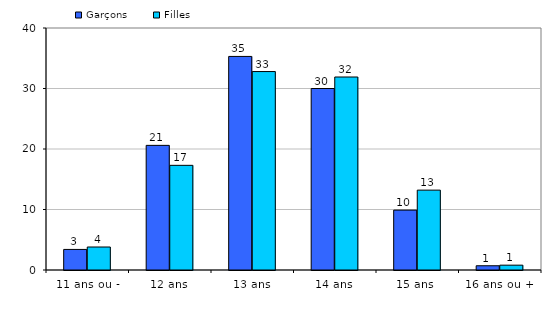
| Category | Garçons | Filles |
|---|---|---|
| 11 ans ou - | 3.4 | 3.8 |
| 12 ans | 20.6 | 17.3 |
| 13 ans | 35.3 | 32.8 |
| 14 ans | 30 | 31.9 |
| 15 ans  | 9.9 | 13.2 |
| 16 ans ou + | 0.7 | 0.8 |